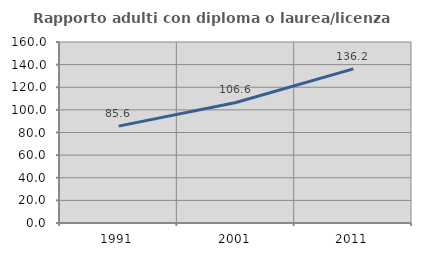
| Category | Rapporto adulti con diploma o laurea/licenza media  |
|---|---|
| 1991.0 | 85.641 |
| 2001.0 | 106.564 |
| 2011.0 | 136.243 |